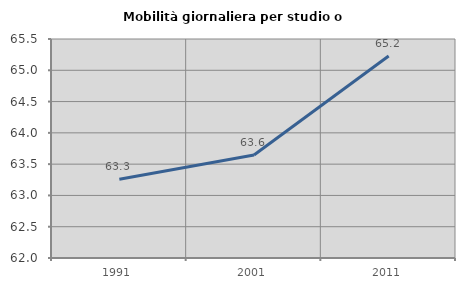
| Category | Mobilità giornaliera per studio o lavoro |
|---|---|
| 1991.0 | 63.258 |
| 2001.0 | 63.645 |
| 2011.0 | 65.228 |